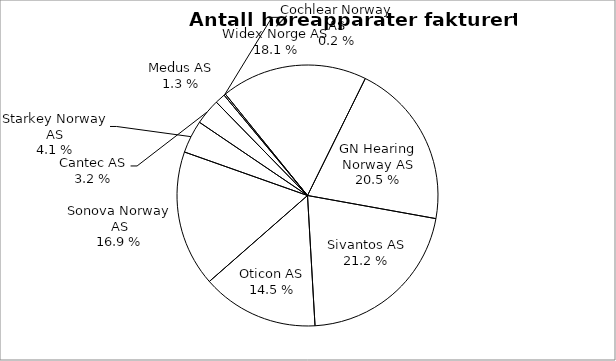
| Category | Series 0 |
|---|---|
| Widex Norge AS | 4863 |
| GN Hearing Norway AS | 5506 |
| Sivantos AS | 5696 |
| Oticon AS | 3880 |
| Sonova Norway AS | 4521 |
| Starkey Norway AS | 1091 |
| Cantec AS | 860 |
| Medus AS | 342 |
| Cochlear Norway AS | 55 |